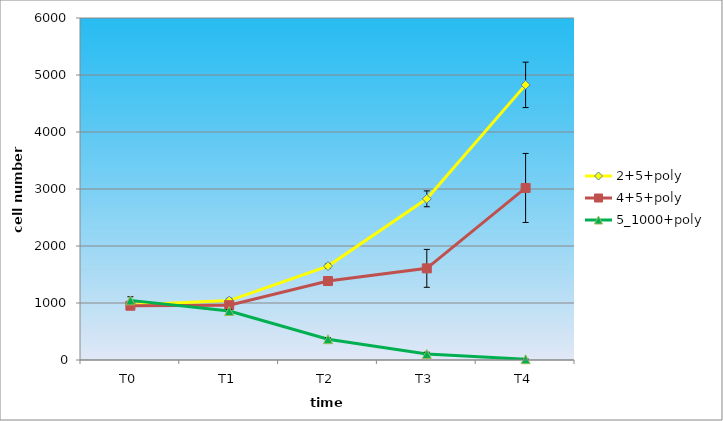
| Category | 2+5+poly | 4+5+poly | 5_1000+poly |
|---|---|---|---|
| T0 | 964.444 | 952.222 | 1046.111 |
| T1 | 1042 | 962 | 859.111 |
| T2 | 1647.222 | 1385.556 | 364.889 |
| T3 | 2827.778 | 1607.778 | 105.111 |
| T4 | 4826.667 | 3018.333 | 13.556 |